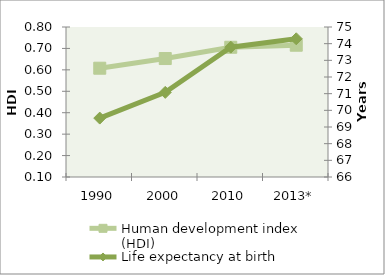
| Category | Human development index (HDI) |
|---|---|
| 1990 | 0.608 |
| 2000 | 0.653 |
| 2010 | 0.705 |
| 2013* | 0.715 |